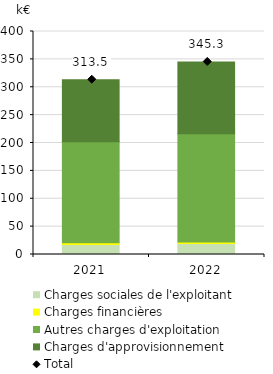
| Category | Charges sociales de l'exploitant | Charges financières | Autres charges d'exploitation | Charges d'approvisionnement |
|---|---|---|---|---|
| 2021.0 | 18.1 | 2.87 | 181.23 | 111.25 |
| 2022.0 | 19.62 | 2.72 | 194.19 | 128.8 |